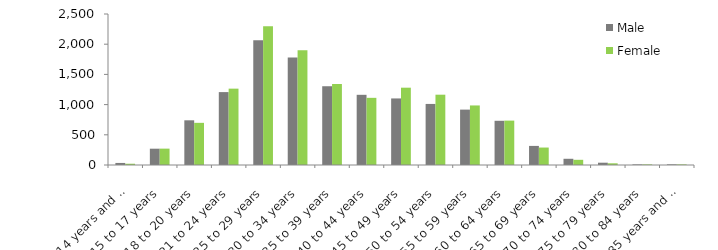
| Category | Male | Female |
|---|---|---|
| 14 years and under | 34 | 21 |
| 15 to 17 years | 270 | 271 |
| 18 to 20 years | 740 | 698 |
| 21 to 24 years | 1207 | 1264 |
| 25 to 29 years | 2065 | 2299 |
| 30 to 34 years | 1779 | 1900 |
| 35 to 39 years | 1304 | 1341 |
| 40 to 44 years | 1162 | 1112 |
| 45 to 49 years | 1102 | 1280 |
| 50 to 54 years | 1011 | 1164 |
| 55 to 59 years | 917 | 986 |
| 60 to 64 years | 732 | 735 |
| 65 to 69 years | 316 | 289 |
| 70 to 74 years | 103 | 86 |
| 75 to 79 years | 38 | 28 |
| 80 to 84 years | 10 | 10 |
| 85 years and over | 11 | 10 |